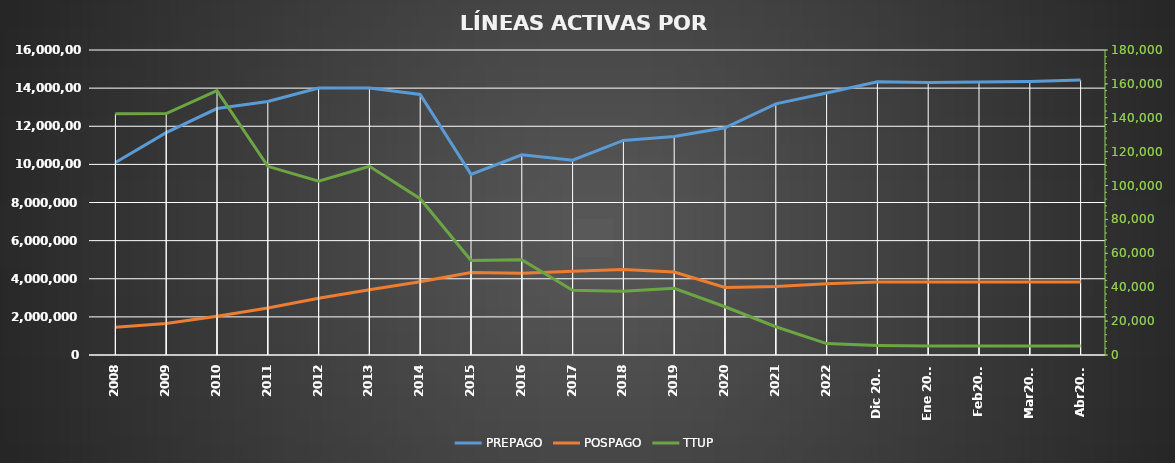
| Category | PREPAGO | POSPAGO |
|---|---|---|
| 2008 | 10097768 | 1452088 |
| 2009 | 11662294 | 1649838 |
| 2010 | 12929040 | 2033814 |
| 2011 | 13295834 | 2467378 |
| 2012 | 14008104 | 2976194 |
| 2013 | 14005126 | 3425277 |
| 2014 | 13666071 | 3846271 |
| 2015 | 9476240 | 4326937 |
| 2016 | 10498467 | 4293426 |
| 2017 | 10219457 | 4393703 |
| 2018 | 11254168 | 4480975 |
| 2019 | 11462048 | 4351686 |
| 2020 | 11917697 | 3539192 |
| 2021 | 13174530 | 3598383 |
| 2022 | 13740159 | 3743849 |
| Dic 2023 | 14330010 | 3829924 |
| Ene 2024 | 14292675 | 3831687 |
| Feb2024 | 14318625 | 3825224 |
| Mar2024 | 14343789 | 3823722 |
| Abr2024 | 14421688 | 3823559 |